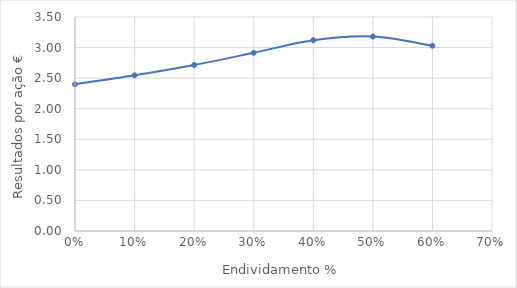
| Category | Series 0 |
|---|---|
| 0.0 | 2.4 |
| 0.1 | 2.547 |
| 0.2 | 2.715 |
| 0.30000000000000004 | 2.914 |
| 0.4 | 3.12 |
| 0.5 | 3.18 |
| 0.6 | 3.03 |